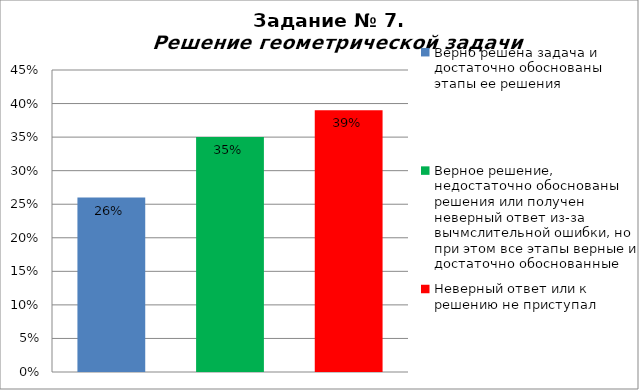
| Category | Решение геометрической задачи  |
|---|---|
| Верно решена задача и достаточно обоснованы этапы ее решения | 0.26 |
| Верное решение, недостаточно обоснованы решения или получен неверный ответ из-за вычмслительной ошибки, но при этом все этапы верные и достаточно обоснованные | 0.35 |
| Неверный ответ или к решению не приступал | 0.39 |